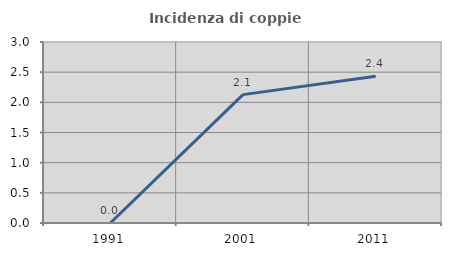
| Category | Incidenza di coppie miste |
|---|---|
| 1991.0 | 0 |
| 2001.0 | 2.128 |
| 2011.0 | 2.431 |